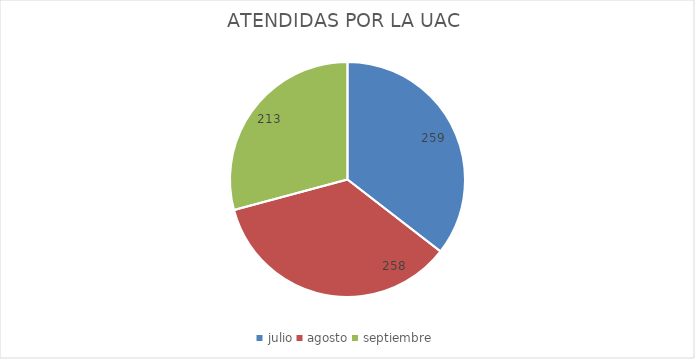
| Category | ATENDIDAS POR LA UAC  |
|---|---|
| julio | 259 |
| agosto | 258 |
| septiembre | 213 |